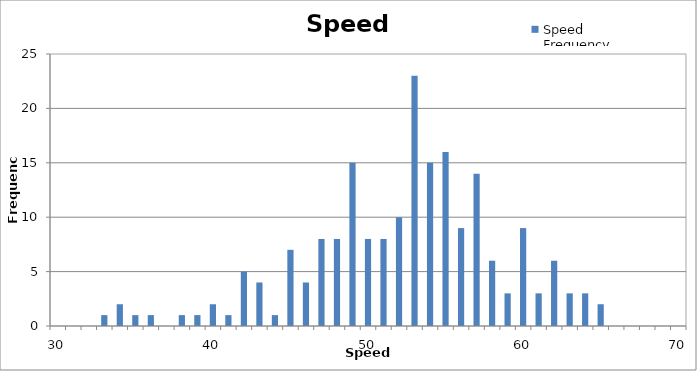
| Category | Speed Frequency |
|---|---|
| 30.0 | 0 |
| 31.0 | 0 |
| 32.0 | 0 |
| 33.0 | 1 |
| 34.0 | 2 |
| 35.0 | 1 |
| 36.0 | 1 |
| 37.0 | 0 |
| 38.0 | 1 |
| 39.0 | 1 |
| 40.0 | 2 |
| 41.0 | 1 |
| 42.0 | 5 |
| 43.0 | 4 |
| 44.0 | 1 |
| 45.0 | 7 |
| 46.0 | 4 |
| 47.0 | 8 |
| 48.0 | 8 |
| 49.0 | 15 |
| 50.0 | 8 |
| 51.0 | 8 |
| 52.0 | 10 |
| 53.0 | 23 |
| 54.0 | 15 |
| 55.0 | 16 |
| 56.0 | 9 |
| 57.0 | 14 |
| 58.0 | 6 |
| 59.0 | 3 |
| 60.0 | 9 |
| 61.0 | 3 |
| 62.0 | 6 |
| 63.0 | 3 |
| 64.0 | 3 |
| 65.0 | 2 |
| 66.0 | 0 |
| 67.0 | 0 |
| 68.0 | 0 |
| 69.0 | 0 |
| 70.0 | 0 |